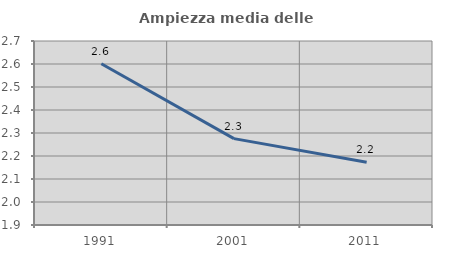
| Category | Ampiezza media delle famiglie |
|---|---|
| 1991.0 | 2.601 |
| 2001.0 | 2.276 |
| 2011.0 | 2.173 |